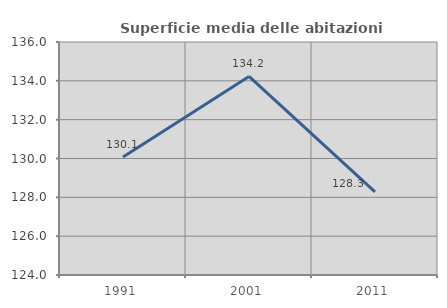
| Category | Superficie media delle abitazioni occupate |
|---|---|
| 1991.0 | 130.079 |
| 2001.0 | 134.226 |
| 2011.0 | 128.282 |